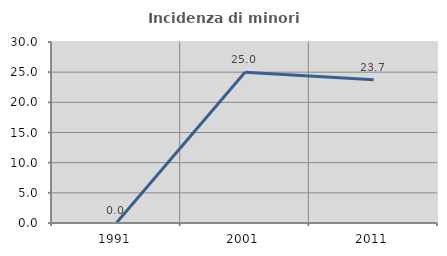
| Category | Incidenza di minori stranieri |
|---|---|
| 1991.0 | 0 |
| 2001.0 | 25 |
| 2011.0 | 23.734 |